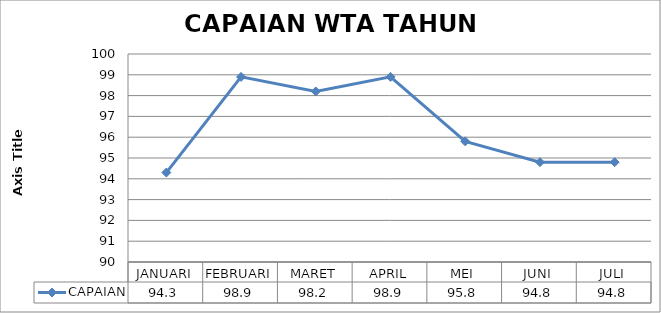
| Category | CAPAIAN |
|---|---|
| JANUARI | 94.3 |
| FEBRUARI | 98.9 |
| MARET | 98.2 |
| APRIL | 98.9 |
| MEI | 95.8 |
| JUNI | 94.8 |
| JULI | 94.8 |